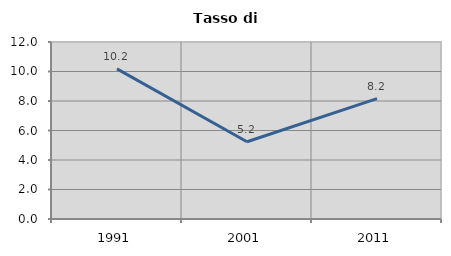
| Category | Tasso di disoccupazione   |
|---|---|
| 1991.0 | 10.181 |
| 2001.0 | 5.236 |
| 2011.0 | 8.157 |